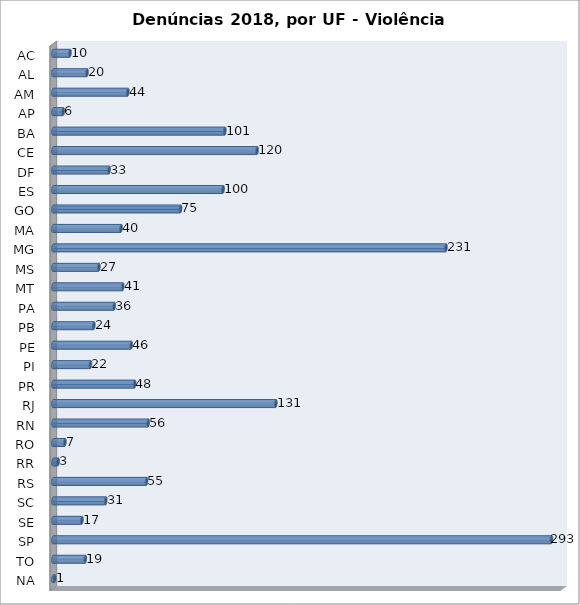
| Category | Series 0 |
|---|---|
| AC | 10 |
| AL | 20 |
| AM | 44 |
| AP | 6 |
| BA | 101 |
| CE | 120 |
| DF | 33 |
| ES | 100 |
| GO | 75 |
| MA | 40 |
| MG | 231 |
| MS | 27 |
| MT | 41 |
| PA | 36 |
| PB | 24 |
| PE | 46 |
| PI | 22 |
| PR | 48 |
| RJ | 131 |
| RN | 56 |
| RO | 7 |
| RR | 3 |
| RS | 55 |
| SC | 31 |
| SE | 17 |
| SP | 293 |
| TO | 19 |
| NA | 1 |